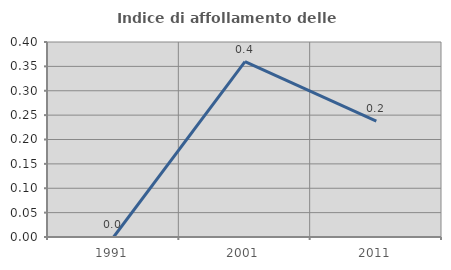
| Category | Indice di affollamento delle abitazioni  |
|---|---|
| 1991.0 | 0 |
| 2001.0 | 0.36 |
| 2011.0 | 0.238 |